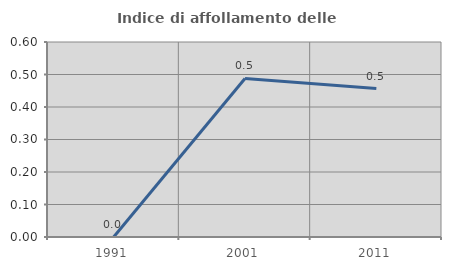
| Category | Indice di affollamento delle abitazioni  |
|---|---|
| 1991.0 | 0 |
| 2001.0 | 0.488 |
| 2011.0 | 0.457 |